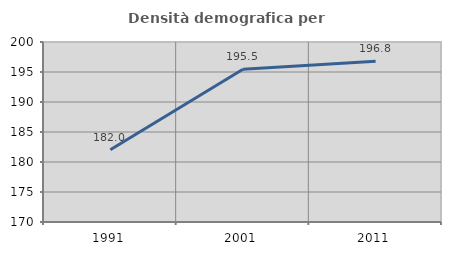
| Category | Densità demografica |
|---|---|
| 1991.0 | 182.04 |
| 2001.0 | 195.463 |
| 2011.0 | 196.792 |